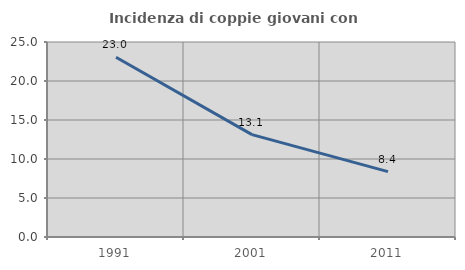
| Category | Incidenza di coppie giovani con figli |
|---|---|
| 1991.0 | 23.039 |
| 2001.0 | 13.131 |
| 2011.0 | 8.38 |